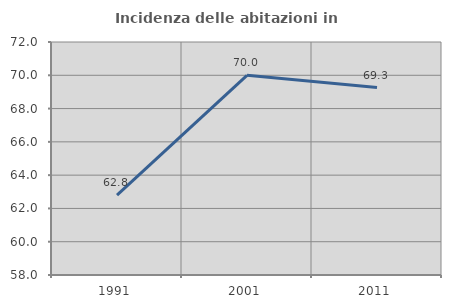
| Category | Incidenza delle abitazioni in proprietà  |
|---|---|
| 1991.0 | 62.799 |
| 2001.0 | 70 |
| 2011.0 | 69.26 |